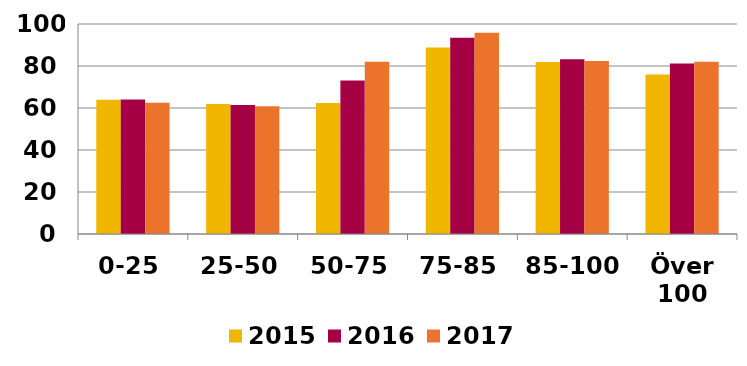
| Category | 2015 | 2016 | 2017 |
|---|---|---|---|
| 0-25 | 63.905 | 63.989 | 62.537 |
| 25-50 | 61.917 | 61.38 | 60.785 |
| 50-75 | 62.37 | 73.036 | 82.001 |
| 75-85 | 88.792 | 93.473 | 95.821 |
| 85-100 | 81.866 | 83.268 | 82.399 |
| Över 100 | 75.937 | 81.22 | 82.069 |